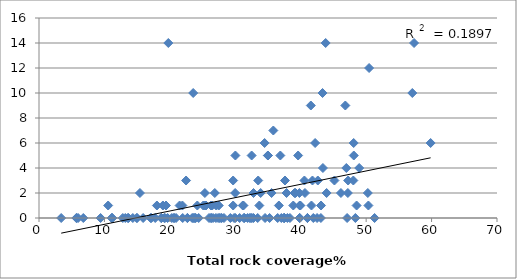
| Category | Total Coverage |
|---|---|
| 41.7999 | 3 |
| 39.6044 | 5 |
| 37.4249 | 0 |
| 33.8753 | 2 |
| 43.8143 | 14 |
| 57.0542 | 10 |
| 41.5457 | 9 |
| 32.7876 | 0 |
| 32.5013 | 5 |
| 34.9906 | 5 |
| 23.9386 | 0 |
| 42.609 | 3 |
| 25.3108 | 1 |
| 48.9453 | 4 |
| 46.8185 | 9 |
| 32.7853 | 2 |
| 29.9842 | 2 |
| 34.4811 | 6 |
| 25.5156 | 1 |
| 26.866 | 2 |
| 35.812 | 7 |
| 22.7023 | 0 |
| 20.6698 | 0 |
| 17.0553 | 0 |
| 31.4073 | 0 |
| 32.3973 | 0 |
| 25.9857 | 0 |
| 27.4743 | 1 |
| 21.9675 | 0 |
| 14.9867 | 0 |
| 26.285 | 0 |
| 30.001 | 0 |
| 27.6109 | 0 |
| 29.8198 | 0 |
| 18.0206 | 1 |
| 34.547 | 0 |
| 31.8858 | 0 |
| 23.5686 | 0 |
| 45.156 | 3 |
| 48.5406 | 1 |
| 29.6756 | 1 |
| 20.9482 | 0 |
| 26.2984 | 1 |
| 34.9833 | 5 |
| 50.4514 | 12 |
| 39.0555 | 2 |
| 48.1069 | 5 |
| 36.8847 | 5 |
| 47.2463 | 3 |
| 39.9541 | 1 |
| 26.4708 | 1 |
| 37.8365 | 2 |
| 48.0954 | 6 |
| 40.6532 | 2 |
| 27.0884 | 1 |
| 43.3943 | 4 |
| 39.8024 | 2 |
| 47.2049 | 2 |
| 37.5969 | 3 |
| 40.5654 | 3 |
| 39.2041 | 2 |
| 24.194 | 1 |
| 36.6608 | 1 |
| 33.5035 | 3 |
| 21.9193 | 1 |
| 32.2117 | 0 |
| 31.1409 | 1 |
| 50.3477 | 1 |
| 39.8544 | 0 |
| 51.2889 | 0 |
| 43.1056 | 1 |
| 42.2048 | 6 |
| 26.5991 | 0 |
| 19.2434 | 0 |
| 37.9666 | 0 |
| 42.5004 | 0 |
| 43.0832 | 0 |
| 39.8507 | 1 |
| 38.8603 | 1 |
| 25.1066 | 1 |
| 30.6638 | 0 |
| 35.5454 | 2 |
| 37.5206 | 0 |
| 31.3048 | 0 |
| 27.8299 | 0 |
| 11.1267 | 0 |
| 10.5701 | 1 |
| 15.9166 | 0 |
| 31.2507 | 1 |
| 17.1689 | 0 |
| 12.8056 | 0 |
| 37.4639 | 0 |
| 41.0315 | 0 |
| 28.275 | 0 |
| 41.9264 | 0 |
| 41.0277 | 0 |
| 43.3362 | 10 |
| 23.4112 | 0 |
| 36.4767 | 0 |
| 13.6832 | 0 |
| 6.76845 | 0 |
| 5.70716 | 0 |
| 5.75567 | 0 |
| 18.678 | 0 |
| 57.3203 | 14 |
| 20.6128 | 0 |
| 30.0138 | 5 |
| 27.3813 | 0 |
| 59.855 | 6 |
| 48.355 | 0 |
| 19.6533 | 0 |
| 27.0406 | 0 |
| 29.2517 | 0 |
| 19.4067 | 1 |
| 9.41249 | 0 |
| 3.39393 | 0 |
| 35.2412 | 0 |
| 23.5687 | 10 |
| 48.0427 | 3 |
| 46.1498 | 2 |
| 21.4901 | 1 |
| 26.342 | 0 |
| 18.7098 | 0 |
| 33.673 | 1 |
| 13.1918 | 0 |
| 18.9391 | 1 |
| 25.352 | 2 |
| 38.3575 | 0 |
| 43.9563 | 2 |
| 50.2539 | 2 |
| 47.0925 | 0 |
| 32.5392 | 0 |
| 27.916 | 0 |
| 39.8209 | 0 |
| 46.9692 | 4 |
| 33.4256 | 0 |
| 22.4783 | 3 |
| 29.6731 | 3 |
| 19.7631 | 14 |
| 11.1908 | 0 |
| 22.6645 | 0 |
| 14.9431 | 0 |
| 24.4035 | 0 |
| 37.0408 | 0 |
| 23.8559 | 0 |
| 15.4283 | 2 |
| 20.2954 | 0 |
| 41.6474 | 1 |
| 11.1535 | 0 |
| 13.5779 | 0 |
| 14.3382 | 0 |
| 17.7663 | 0 |
| 19.1556 | 0 |
| 23.7177 | 0 |
| 5.97051 | 0 |